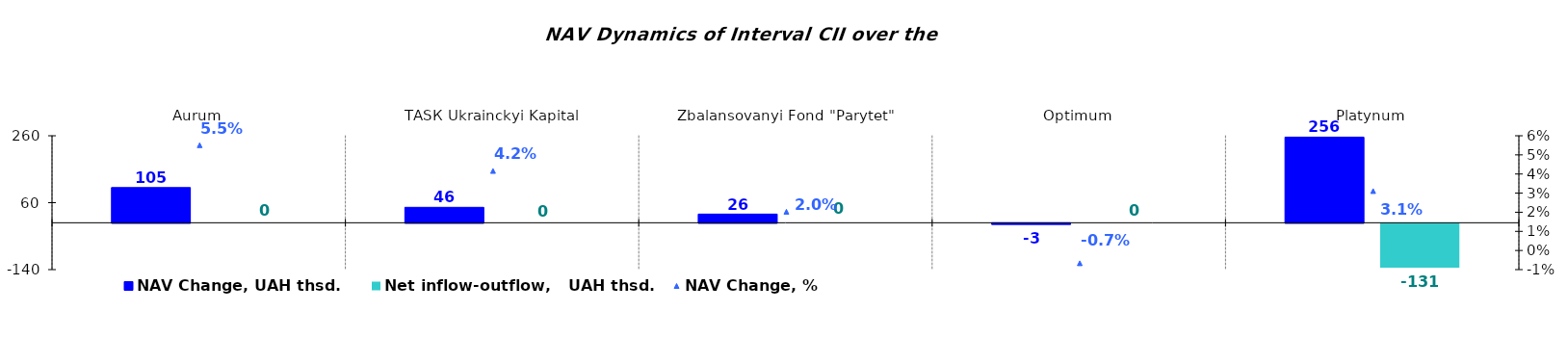
| Category | NAV Change, UAH thsd. | Net inflow-outflow,   UAH thsd. |
|---|---|---|
| Аurum | 105.254 | 0 |
| ТАSК Ukrainckyi Kapital | 46.122 | 0 |
| Zbalansovanyi Fond "Parytet" | 25.904 | 0 |
| Оptimum | -3.149 | 0 |
| Platynum | 255.992 | -131.472 |